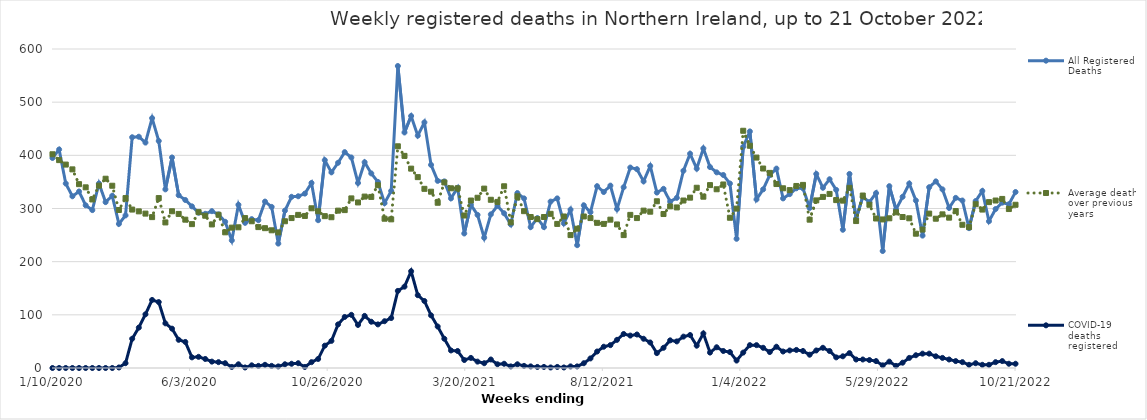
| Category | All Registered Deaths | Average deaths over previous 5 years | COVID-19 deaths registered |
|---|---|---|---|
| 1/10/20 | 395 | 402 | 0 |
| 1/17/20 | 411 | 391 | 0 |
| 1/24/20 | 347 | 382.6 | 0 |
| 1/31/20 | 323 | 373.6 | 0 |
| 2/7/20 | 332 | 345.8 | 0 |
| 2/14/20 | 306 | 339.8 | 0 |
| 2/21/20 | 297 | 317 | 0 |
| 2/28/20 | 347 | 343 | 0 |
| 3/6/20 | 312 | 356 | 0 |
| 3/13/20 | 324 | 342.8 | 0 |
| 3/20/20 | 271 | 297.2 | 1 |
| 3/27/20 | 287 | 319.6 | 9 |
| 4/3/20 | 434 | 298 | 55 |
| 4/10/20 | 435 | 294.6 | 76 |
| 4/17/20 | 424 | 290.4 | 101 |
| 4/24/20 | 470 | 283.8 | 128 |
| 5/1/20 | 427 | 319.6 | 124 |
| 5/8/20 | 336 | 273.8 | 84 |
| 5/15/20 | 396 | 294.8 | 74 |
| 5/22/20 | 325 | 289.8 | 53 |
| 5/29/20 | 316 | 279 | 49 |
| 6/5/20 | 304 | 270.6 | 20 |
| 6/12/20 | 292 | 293.2 | 21 |
| 6/19/20 | 290 | 286.4 | 17 |
| 6/26/20 | 295 | 270 | 12 |
| 7/3/20 | 289 | 288.2 | 11 |
| 7/10/20 | 275 | 255.2 | 9 |
| 7/17/20 | 240 | 264 | 2 |
| 7/24/20 | 307 | 264.6 | 7 |
| 7/31/20 | 273 | 282 | 1 |
| 8/7/20 | 280 | 276 | 5 |
| 8/14/20 | 278 | 265 | 4 |
| 8/21/20 | 313 | 263 | 6 |
| 8/28/20 | 303 | 259 | 4 |
| 9/4/20 | 234 | 255 | 3 |
| 9/11/20 | 296 | 276 | 7 |
| 9/18/20 | 322 | 282 | 8 |
| 9/25/20 | 323 | 288 | 9 |
| 10/2/20 | 328 | 286 | 2 |
| 10/9/20 | 348 | 300.4 | 11 |
| 10/16/20 | 278 | 294.8 | 17 |
| 10/23/20 | 391 | 285.6 | 42 |
| 10/30/20 | 368 | 283.6 | 51 |
| 11/6/20 | 386 | 296 | 82 |
| 11/13/20 | 406 | 297 | 96 |
| 11/20/20 | 396 | 319 | 100 |
| 11/27/20 | 348 | 311.4 | 81 |
| 12/4/20 | 387 | 322.4 | 98 |
| 12/11/20 | 366 | 321.8 | 87 |
| 12/18/20 | 350 | 343.8 | 82 |
| 12/25/20 | 310 | 280.8 | 88 |
| 1/1/21 | 333 | 279.6 | 94 |
| 1/8/21 | 568 | 417 | 145 |
| 1/15/21 | 443 | 399 | 153 |
| 1/22/21 | 474 | 375 | 182 |
| 1/29/21 | 437 | 359 | 137 |
| 2/5/21 | 462 | 337 | 126 |
| 2/12/21 | 382 | 331.6 | 99 |
| 2/19/21 | 352 | 310.8 | 78 |
| 2/26/21 | 351 | 349 | 55 |
| 3/5/21 | 319 | 338 | 33 |
| 3/12/21 | 339 | 338 | 32 |
| 3/19/21 | 253 | 286.8 | 15 |
| 3/26/21 | 307 | 315 | 19 |
| 4/2/21 | 288 | 320.2 | 12 |
| 4/9/21 | 245 | 337.4 | 9 |
| 4/16/21 | 289 | 316.4 | 16 |
| 4/23/21 | 305 | 312.4 | 7 |
| 4/30/21 | 291 | 341.8 | 8 |
| 5/7/21 | 270 | 274 | 3 |
| 5/14/21 | 329 | 323 | 7 |
| 5/21/21 | 319 | 295 | 4 |
| 5/28/21 | 265 | 284 | 3 |
| 6/4/21 | 282 | 280 | 2 |
| 6/11/21 | 265 | 284 | 2 |
| 6/18/21 | 313 | 290 | 1 |
| 6/25/21 | 319 | 271 | 2 |
| 7/2/21 | 272 | 285 | 1 |
| 7/9/21 | 298 | 250 | 3 |
| 7/16/21 | 231 | 262 | 3 |
| 7/23/21 | 306 | 285 | 9 |
| 7/30/21 | 293 | 282 | 18 |
| 8/6/21 | 342 | 273 | 31 |
| 8/13/21 | 331 | 271 | 40 |
| 8/20/21 | 343 | 279 | 43 |
| 8/27/21 | 299 | 270 | 53 |
| 9/3/21 | 340 | 250 | 64 |
| 9/10/21 | 377 | 288 | 61 |
| 9/17/21 | 374 | 282 | 63 |
| 9/24/21 | 351 | 296 | 55 |
| 10/1/21 | 380 | 294 | 48 |
| 10/8/21 | 330 | 313.6 | 28 |
| 10/15/21 | 337 | 289.6 | 38 |
| 10/22/21 | 313 | 304 | 52 |
| 10/29/21 | 320 | 302 | 50 |
| 11/5/21 | 371 | 315 | 59 |
| 11/12/21 | 403 | 320.4 | 62 |
| 11/19/21 | 375 | 339 | 42 |
| 11/26/21 | 413 | 322.2 | 65 |
| 12/3/21 | 378 | 344 | 29 |
| 12/10/21 | 368 | 336.2 | 39 |
| 12/17/21 | 363 | 345.2 | 32 |
| 12/24/21 | 347 | 282.6 | 30 |
| 12/31/21 | 243 | 299.8 | 14 |
| 1/7/22 | 416 | 446.2 | 29 |
| 1/14/22 | 445 | 418 | 43 |
| 1/21/22 | 317 | 395.8 | 43 |
| 1/28/22 | 336 | 375.2 | 38 |
| 2/4/22 | 363 | 367 | 30 |
| 2/11/22 | 375 | 346 | 40 |
| 2/18/22 | 319 | 338 | 31 |
| 2/25/22 | 327 | 334.6 | 33 |
| 3/4/22 | 338 | 342.4 | 34 |
| 3/11/22 | 338 | 344.4 | 32 |
| 3/18/22 | 301 | 279 | 25 |
| 3/25/22 | 365 | 315.2 | 33 |
| 4/1/22 | 339 | 321.8 | 38 |
| 4/8/22 | 355 | 327.4 | 32 |
| 4/15/22 | 335 | 315.8 | 20 |
| 4/22/22 | 260 | 314.8 | 22 |
| 4/29/22 | 365 | 338.8 | 28 |
| 5/6/22 | 281 | 276.4 | 16 |
| 5/13/22 | 322 | 324.4 | 16 |
| 5/20/22 | 312 | 307 | 15 |
| 5/27/22 | 329 | 281.2 | 13 |
| 6/3/22 | 220 | 279.4 | 5 |
| 6/10/22 | 342 | 281.6 | 12 |
| 6/17/22 | 298 | 292.8 | 4 |
| 6/24/22 | 322 | 284 | 10 |
| 7/1/22 | 347 | 281.6 | 19 |
| 7/8/22 | 315 | 252.6 | 24 |
| 7/15/22 | 249 | 260.4 | 27 |
| 7/22/22 | 340 | 290.4 | 27 |
| 7/29/22 | 351 | 280.8 | 22 |
| 8/5/22 | 336 | 289 | 19 |
| 8/12/22 | 301 | 282.8 | 16 |
| 8/19/22 | 320 | 295.2 | 13 |
| 8/26/22 | 315 | 269.4 | 11 |
| 9/2/22 | 263 | 265 | 6 |
| 9/9/22 | 314 | 308 | 9 |
| 9/16/22 | 333 | 298 | 6 |
| 9/23/22 | 276 | 312 | 6 |
| 9/30/22 | 299 | 315 | 11 |
| 10/7/22 | 311 | 318 | 13 |
| 10/14/22 | 308 | 299 | 8 |
| 10/21/22 | 331 | 307 | 8 |